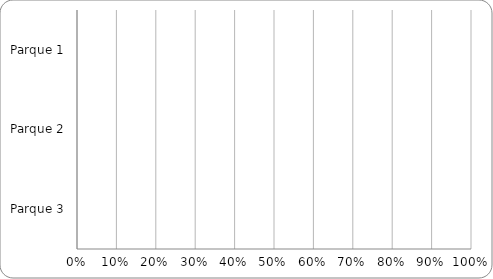
| Category | Porcentaje de cumplimiento de Indicadores obligatorios secundarios |
|---|---|
| Parque 1 | 0 |
| Parque 2 | 0 |
| Parque 3 | 0 |